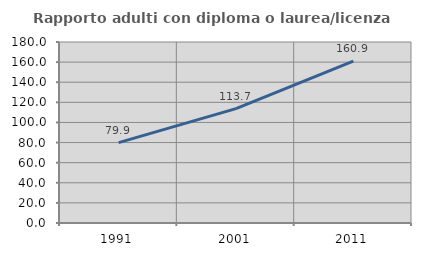
| Category | Rapporto adulti con diploma o laurea/licenza media  |
|---|---|
| 1991.0 | 79.882 |
| 2001.0 | 113.706 |
| 2011.0 | 160.947 |